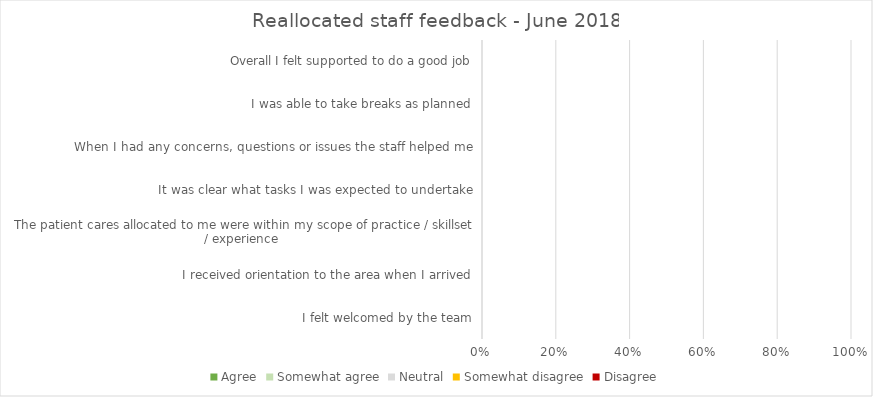
| Category | Agree | Somewhat agree | Neutral | Somewhat disagree | Disagree |
|---|---|---|---|---|---|
| I felt welcomed by the team | 0 | 0 | 0 | 0 | 0 |
| I received orientation to the area when I arrived | 0 | 0 | 0 | 0 | 0 |
| The patient cares allocated to me were within my scope of practice / skillset / experience  | 0 | 0 | 0 | 0 | 0 |
| It was clear what tasks I was expected to undertake | 0 | 0 | 0 | 0 | 0 |
| When I had any concerns, questions or issues the staff helped me | 0 | 0 | 0 | 0 | 0 |
| I was able to take breaks as planned | 0 | 0 | 0 | 0 | 0 |
| Overall I felt supported to do a good job | 0 | 0 | 0 | 0 | 0 |